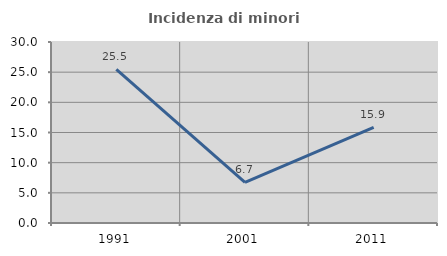
| Category | Incidenza di minori stranieri |
|---|---|
| 1991.0 | 25.455 |
| 2001.0 | 6.731 |
| 2011.0 | 15.868 |